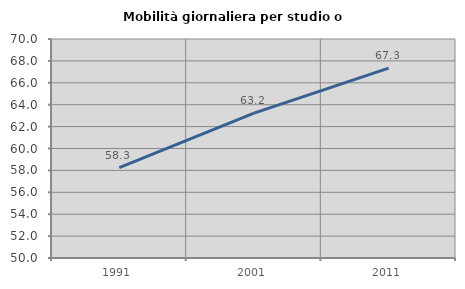
| Category | Mobilità giornaliera per studio o lavoro |
|---|---|
| 1991.0 | 58.263 |
| 2001.0 | 63.232 |
| 2011.0 | 67.342 |